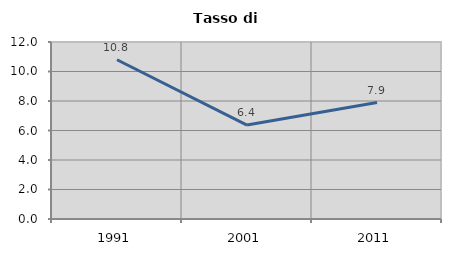
| Category | Tasso di disoccupazione   |
|---|---|
| 1991.0 | 10.798 |
| 2001.0 | 6.37 |
| 2011.0 | 7.896 |